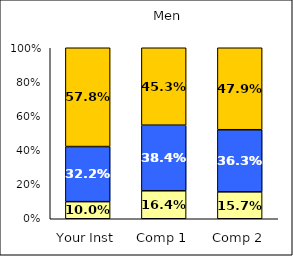
| Category | Low Social Self-Concept | Average Social Self-Concept | High Social Self-Concept |
|---|---|---|---|
| Your Inst | 0.1 | 0.322 | 0.578 |
| Comp 1 | 0.164 | 0.384 | 0.453 |
| Comp 2 | 0.157 | 0.363 | 0.479 |